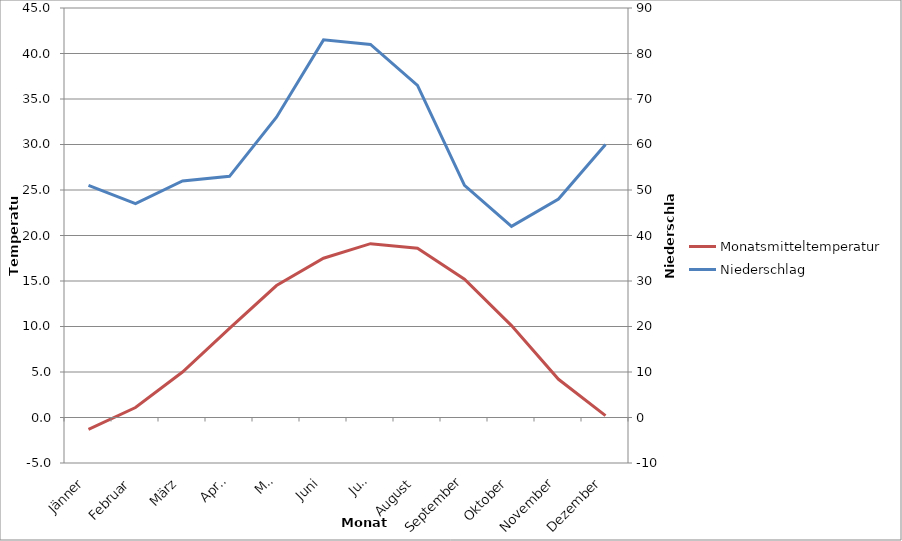
| Category | Monatsmitteltemperatur |
|---|---|
| Jänner | -1.3 |
| Februar | 1.1 |
| März | 5 |
| April | 9.8 |
| Mai | 14.5 |
| Juni | 17.5 |
| Juli | 19.1 |
| August | 18.6 |
| September | 15.2 |
| Oktober | 10.1 |
| November | 4.2 |
| Dezember | 0.2 |